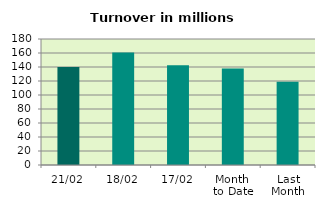
| Category | Series 0 |
|---|---|
| 21/02 | 139.935 |
| 18/02 | 160.689 |
| 17/02 | 142.472 |
| Month 
to Date | 137.922 |
| Last
Month | 119.055 |